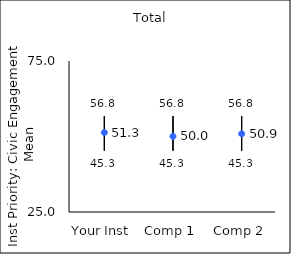
| Category | 25th percentile | 75th percentile | Mean |
|---|---|---|---|
| Your Inst | 45.3 | 56.8 | 51.32 |
| Comp 1 | 45.3 | 56.8 | 50.04 |
| Comp 2 | 45.3 | 56.8 | 50.89 |